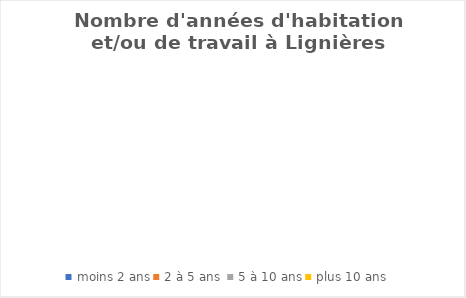
| Category | Series 0 |
|---|---|
| moins 2 ans | 0 |
| 2 à 5 ans  | 0 |
| 5 à 10 ans | 0 |
| plus 10 ans  | 0 |